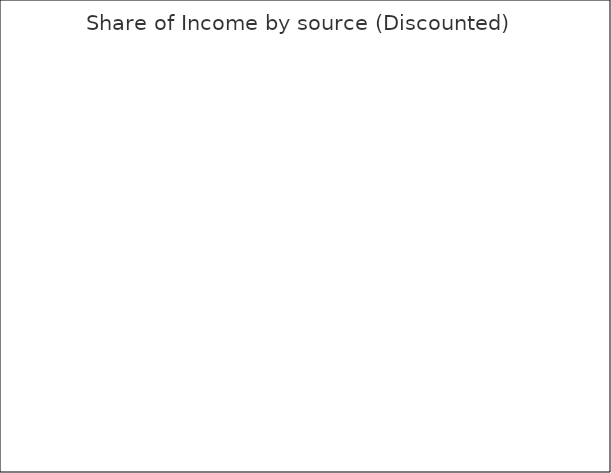
| Category | Series 1 |
|---|---|
| Carbon | 0 |
| Grant | 0 |
| Timber | 0 |
| Donations | 0 |
| Other | 0 |